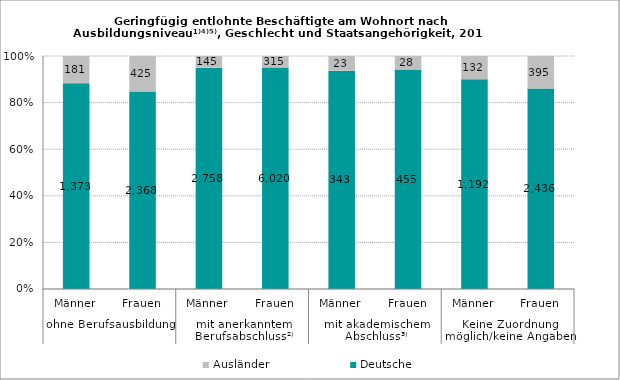
| Category | Deutsche | Ausländer |
|---|---|---|
| 0 | 1373 | 181 |
| 1 | 2368 | 425 |
| 2 | 2758 | 145 |
| 3 | 6020 | 315 |
| 4 | 343 | 23 |
| 5 | 455 | 28 |
| 6 | 1192 | 132 |
| 7 | 2436 | 395 |